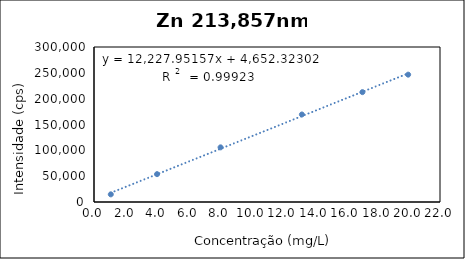
| Category | Series 0 |
|---|---|
| 1.0679225183912893 | 14783.069 |
| 4.0094676467472405 | 53933.569 |
| 8.047058203061766 | 105781.969 |
| 13.218711835487444 | 169362.969 |
| 17.06672541316652 | 212646.969 |
| 19.97461278586724 | 246467.969 |